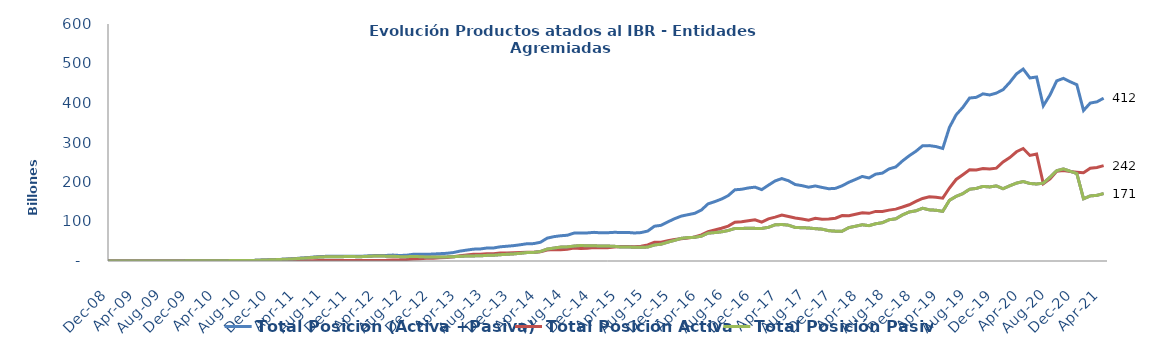
| Category | Total Posición (Activa +Pasiva) | Total Posición Activa | Total Posición Pasiva |
|---|---|---|---|
| 2008-07-01 | 0 | 0 | 0 |
| 2008-08-01 | 0 | 0 | 0 |
| 2008-09-01 | 1000000 | 0 | 1000000 |
| 2008-10-01 | 1000000 | 0 | 1000000 |
| 2008-11-01 | 0 | 0 | 0 |
| 2008-12-01 | 0 | 0 | 0 |
| 2009-01-01 | 0 | 0 | 0 |
| 2009-02-01 | 7428500000 | 7428500000 | 0 |
| 2009-03-01 | 7428500000 | 7428500000 | 0 |
| 2009-04-01 | 7428500000 | 7428500000 | 0 |
| 2009-05-01 | 7428500000 | 7428500000 | 0 |
| 2009-06-01 | 7428500000 | 7428500000 | 0 |
| 2009-07-01 | 184628500000 | 7428500000 | 177200000000 |
| 2009-08-01 | 184628500000 | 7428500000 | 177200000000 |
| 2009-09-01 | 184628500000 | 7428500000 | 177200000000 |
| 2009-10-01 | 185129500000 | 7928500000 | 177201000000 |
| 2009-11-01 | 333829500000 | 22928500000 | 310901000000 |
| 2009-12-01 | 508529500000 | 22928500000 | 485601000000 |
| 2010-01-01 | 523329500000 | 23328500000 | 500001000000 |
| 2010-02-01 | 561579500000 | 23328500000 | 538251000000 |
| 2010-03-01 | 890799500000 | 24228500000 | 866571000000 |
| 2010-04-01 | 934149500000 | 32228500000 | 901921000000 |
| 2010-05-01 | 972149500000 | 46928500000 | 925221000000 |
| 2010-06-01 | 1019749500000 | 57928500000 | 961821000000 |
| 2010-07-01 | 1054749500000 | 71928500000 | 982821000000 |
| 2010-08-01 | 1096821000000 | 66500000000 | 1030321000000 |
| 2010-09-01 | 1351421000000 | 57500000000 | 1293921000000 |
| 2010-10-01 | 2086289000000 | 111000000000 | 1975289000000 |
| 2010-11-01 | 2726579030230 | 114000000000 | 2612579030230 |
| 2010-12-01 | 3205380030230 | 113971000000 | 3091409030230 |
| 2011-01-01 | 3891216030230 | 114971000000 | 3776245030230 |
| 2011-02-01 | 4740024311520 | 219471000000 | 4520553311520 |
| 2011-03-01 | 5575075311520 | 377371000000 | 5197704311520 |
| 2011-04-01 | 7038592281290 | 509371000000 | 6529221281290 |
| 2011-05-01 | 8099489881774 | 597145000000 | 7502344881774 |
| 2011-06-01 | 9725086346191 | 765169000000 | 8959917346191 |
| 2011-07-01 | 10999513570652 | 996669000000 | 10002844570652 |
| 2011-08-01 | 11811490085668 | 1214169000000 | 10597321085668 |
| 2011-09-01 | 12092316282168 | 1148069000000 | 10944247282168 |
| 2011-10-01 | 11974470459718 | 1135571874050 | 10838898585668 |
| 2011-11-01 | 12176418287184 | 984599000000 | 11191819287184 |
| 2011-12-01 | 12288842763684 | 983099000000 | 11305743763684 |
| 2012-01-01 | 11701287811238 | 1008599000000 | 10692688811238 |
| 2012-02-01 | 12706230411238 | 1105569000000 | 11600661411238 |
| 2012-03-01 | 13561575207334 | 1160099000000 | 12401476207334 |
| 2012-04-01 | 14046325467338 | 1471099000000 | 12575226467338 |
| 2012-05-01 | 14094647073338 | 1804949000000 | 12289698073338 |
| 2012-06-01 | 14980264763536 | 2682753000000 | 12297511763536 |
| 2012-07-01 | 13983506536392.6 | 2975989400932.6 | 11007517135460 |
| 2012-08-01 | 14511342381537.73 | 3747251409383.73 | 10764090972154 |
| 2012-09-01 | 16937362887762.46 | 5346076915608.46 | 11591285972154 |
| 2012-10-01 | 16867323467297.76 | 5927222995143.76 | 10940100472154 |
| 2012-11-01 | 16957687120024.45 | 6827721606539.45 | 10129965513485 |
| 2012-12-01 | 17619213721064.83 | 7264421085065.83 | 10354792635999 |
| 2013-01-01 | 18549778788681.95 | 8296359799905.279 | 10253418988776.67 |
| 2013-02-01 | 19435840251568.38 | 9025528305106.379 | 10410311946462 |
| 2013-03-01 | 21350496757475.97 | 10610182541484.97 | 10740314215991 |
| 2013-04-01 | 25044328892886.617 | 13133059577950.62 | 11911269314936 |
| 2013-05-01 | 27540403190960.062 | 14960233266686.31 | 12580169924273.75 |
| 2013-06-01 | 30001766547101.754 | 17049524776131 | 12952241770970.75 |
| 2013-07-01 | 30415841990108.754 | 17382486278583 | 13033355711525.75 |
| 2013-08-01 | 32855099846458.246 | 18580739748972 | 14274360097486.25 |
| 2013-09-01 | 32976502369371.246 | 18407429561787 | 14569072807584.25 |
| 2013-10-01 | 35959569368735.19 | 19992346917073.383 | 15967222451661.8 |
| 2013-11-01 | 37338647357799.75 | 20384941433230.95 | 16953705924568.8 |
| 2013-12-01 | 38888505779144.55 | 20939970782609.754 | 17948534996534.8 |
| 2014-01-01 | 41103172396366.16 | 21609706461008.36 | 19493465935357.8 |
| 2014-02-01 | 43730091166840.81 | 22338455450529.008 | 21391635716311.8 |
| 2014-03-01 | 44014768230115.07 | 22272030193312.27 | 21742738036802.8 |
| 2014-04-01 | 47430724239336.83 | 23422937479203.03 | 24007786760133.8 |
| 2014-05-01 | 57834426276868.516 | 27674659964612.28 | 30159766312256.23 |
| 2014-06-01 | 61600955025680.43 | 28872171652456.2 | 32728783373224.23 |
| 2014-07-01 | 63885132140809.125 | 28702458561582.03 | 35182673579227.09 |
| 2014-08-01 | 65175133555848.31 | 29435167088741.88 | 35739966467106.44 |
| 2014-09-01 | 70606691467799.84 | 32831024190733.098 | 37775667277066.74 |
| 2014-10-01 | 71051997442592.78 | 31855183242802.297 | 39196814199790.49 |
| 2014-11-01 | 71115134748566.56 | 32585871229814.906 | 38529263518751.65 |
| 2014-12-01 | 72525676073088.9 | 33921493945222.32 | 38604182127866.58 |
| 2015-01-01 | 71271574040027.69 | 33430948122193.57 | 37840625917834.125 |
| 2015-02-01 | 71566513266069.4 | 33707551044151.4 | 37858962221918 |
| 2015-03-01 | 72569028292197.1 | 35240251694194.734 | 37328776598002.37 |
| 2015-04-01 | 72284407635002.38 | 36978226535327.29 | 35306181099675.08 |
| 2015-05-01 | 72379825993554.31 | 36677826813740.74 | 35701999179813.58 |
| 2015-06-01 | 70934232494211.97 | 36341054921697.64 | 34593177572514.32 |
| 2015-07-01 | 71925911515818.6 | 37449597485067.67 | 34476314030750.92 |
| 2015-08-01 | 75819411537731.48 | 40476268719214.67 | 35343142818516.81 |
| 2015-09-01 | 88024514896767.1 | 47423423192943 | 40601091703824.09 |
| 2015-10-01 | 90376727278611.56 | 47767203933521.14 | 42609523345090.43 |
| 2015-11-01 | 99012993745053.11 | 51298569770898.03 | 47714423974155.08 |
| 2015-12-01 | 107008749487979.02 | 54758099038919.11 | 52250650449059.89 |
| 2016-01-01 | 113661574588642.9 | 56331160756973.97 | 57330413831668.94 |
| 2016-02-01 | 117225015006954.34 | 57909509197116.14 | 59315505809838.21 |
| 2016-03-01 | 120669820452450.66 | 60722748977001.484 | 59947071475449.17 |
| 2016-04-01 | 129040983634768.84 | 66178255126135.42 | 62862728508633.42 |
| 2016-05-01 | 144700379703761.53 | 74162617699926 | 70537762003835.53 |
| 2016-06-01 | 150304379111854.44 | 78377250605963.84 | 71927128505890.6 |
| 2016-07-01 | 156812723823687.1 | 82955508331840.11 | 73857215491846.98 |
| 2016-08-01 | 165444572236951 | 88276550125987.88 | 77168022110963.12 |
| 2016-09-01 | 180247481204752.16 | 97990348411005.16 | 82257132793747.02 |
| 2016-10-01 | 181569726283085.44 | 99190320785310.78 | 82379405497774.64 |
| 2016-11-01 | 184930356175967.25 | 101858145365331.95 | 83072210810635.31 |
| 2016-12-01 | 187019078701499.56 | 104426020271926.45 | 82593058429573.12 |
| 2017-01-01 | 180717599779259.44 | 98342098801930.34 | 82375500977329.1 |
| 2017-02-01 | 191914936110978.38 | 106635932569865.05 | 85279003541113.31 |
| 2017-03-01 | 202712151186918.75 | 111093841827062.03 | 91618309359856.7 |
| 2017-04-01 | 208712921786598.44 | 116358628666288.72 | 92354293120309.72 |
| 2017-05-01 | 203156118525042.3 | 112464530045620.02 | 90691588479422.28 |
| 2017-06-01 | 193587897232076.56 | 108642745845616.36 | 84945151386460.22 |
| 2017-07-01 | 190785975919763.38 | 106534349795344.66 | 84251626124418.72 |
| 2017-08-01 | 186835458365348.25 | 103243442359903.69 | 83592016005444.58 |
| 2017-09-01 | 189956082995096.8 | 108148190109574.17 | 81807892885522.62 |
| 2017-10-01 | 186238156699396.06 | 105639300759532 | 80598855939864.06 |
| 2017-11-01 | 182912971216385.97 | 106198065459860.58 | 76714905756525.44 |
| 2017-12-01 | 183933570178700.62 | 108408970543558.03 | 75524599635142.58 |
| 2018-01-01 | 190424775932458.47 | 114943825229509.72 | 75480950702948.75 |
| 2018-02-01 | 199397563470704.5 | 114794441925964.78 | 84603121544739.73 |
| 2018-03-01 | 206599379846535.78 | 118542976386628.56 | 88056403459907.22 |
| 2018-04-01 | 214049245063754.12 | 122316493524125.72 | 91732751539628.39 |
| 2018-05-01 | 210207792880960.06 | 120682410832846.97 | 89525382048113.08 |
| 2018-06-01 | 219901855771780.88 | 125584292257677.75 | 94317563514103.12 |
| 2018-07-01 | 222464661118893.2 | 125490160168957.62 | 96974500949935.58 |
| 2018-08-01 | 233197164382865.06 | 128762857401461.97 | 104434306981403.1 |
| 2018-09-01 | 238138413897634.5 | 131365417268308.8 | 106772996629325.72 |
| 2018-10-01 | 253384775618417.97 | 136616212577415.81 | 116768563041002.19 |
| 2018-11-01 | 266418937717877.38 | 142363157445231.12 | 124055780272646.25 |
| 2018-12-01 | 277772721069584.12 | 150720411980092.44 | 127052309089491.69 |
| 2019-01-01 | 291858612471002.9 | 158283758995387.56 | 133574853475615.28 |
| 2019-02-01 | 292101641913975.5 | 162644666424391.3 | 129456975489584.22 |
| 2019-03-01 | 289727416506685.4 | 161249314539374.06 | 128478101967311.33 |
| 2019-04-01 | 284896810837116.56 | 159138639592346.12 | 125758171244770.44 |
| 2019-05-01 | 338346503446509.75 | 184718287806282.9 | 153628215640226.88 |
| 2019-06-01 | 370093564258665.06 | 206410540298487.2 | 163683023960177.88 |
| 2019-07-01 | 388961974809432.4 | 218450632039062.62 | 170511342770369.75 |
| 2019-08-01 | 412556863802076.9 | 230894872814072.1 | 181661990988004.75 |
| 2019-09-01 | 414341203404225.75 | 230584707366943.97 | 183756496037281.8 |
| 2019-10-01 | 423121599152430.5 | 234315054373881.84 | 188806544778548.62 |
| 2019-11-01 | 420297583715940.25 | 232795683034519.5 | 187501900681420.72 |
| 2019-12-01 | 425121786712055.25 | 235038128039683.3 | 190083658672371.9 |
| 2020-01-01 | 433760937398372.25 | 250775176088040.94 | 182985761310331.3 |
| 2020-02-01 | 452249694204831.94 | 261787540108560.38 | 190462154096271.56 |
| 2020-03-01 | 473733363412357.94 | 276549357776419.94 | 197184005635937.97 |
| 2020-04-01 | 485946528476357.5 | 284804153029848.5 | 201142375446508.97 |
| 2020-05-01 | 463392422484105.56 | 267178106936843.62 | 196214315547261.94 |
| 2020-06-01 | 465830697645280.25 | 270870940808937.12 | 194959756836343.16 |
| 2020-07-01 | 392954606465496.9 | 195732895252055.4 | 197221711213441.5 |
| 2020-08-01 | 420396621167288.75 | 208138134881866.28 | 212258486285422.47 |
| 2020-09-01 | 456049107253916.6 | 227421935397940.78 | 228627171855975.84 |
| 2020-10-01 | 462416479645866.75 | 229337501481845.12 | 233078978164021.62 |
| 2020-11-01 | 453890221542032.5 | 226574569764962.16 | 227315651777070.38 |
| 2020-12-01 | 446313243164932.4 | 224938519796198.34 | 221374723368734.06 |
| 2021-01-01 | 380990731517508.6 | 223484273599387.1 | 157506457918121.56 |
| 2021-02-01 | 399822133207244.7 | 235053263938089.28 | 164768869269155.4 |
| 2021-03-01 | 402984520807889.5 | 236772441835594.34 | 166212078972295.2 |
| 2021-04-01 | 412233066709772.06 | 241512760209592.72 | 170720306500179.28 |